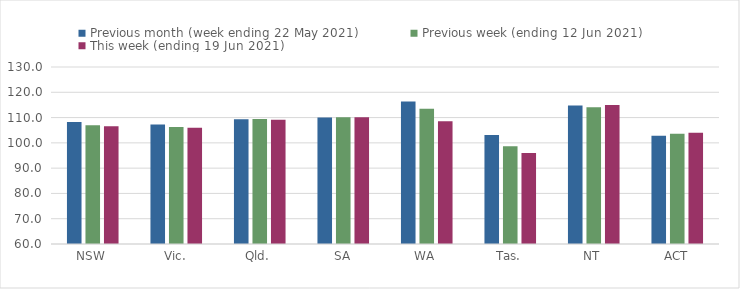
| Category | Previous month (week ending 22 May 2021) | Previous week (ending 12 Jun 2021) | This week (ending 19 Jun 2021) |
|---|---|---|---|
| NSW | 108.22 | 107.01 | 106.54 |
| Vic. | 107.28 | 106.27 | 105.96 |
| Qld. | 109.3 | 109.46 | 109.11 |
| SA | 109.99 | 110.12 | 110.16 |
| WA | 116.34 | 113.51 | 108.59 |
| Tas. | 103.15 | 98.64 | 95.94 |
| NT | 114.8 | 114.08 | 114.95 |
| ACT | 102.77 | 103.56 | 104 |